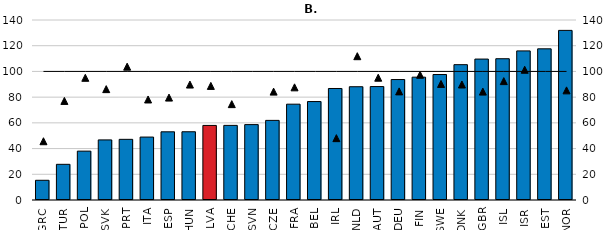
| Category | 1-9 persons employed |
|---|---|
| GRC | 15.326 |
| TUR | 27.756 |
| POL | 38.006 |
| SVK | 46.738 |
| PRT | 47.185 |
| ITA | 48.942 |
| ESP | 53.031 |
| HUN | 53.082 |
| LVA | 58.004 |
| CHE | 58.036 |
| SVN | 58.636 |
| CZE | 61.92 |
| FRA | 74.529 |
| BEL | 76.573 |
| IRL | 86.727 |
| NLD | 88.1 |
| AUT | 88.227 |
| DEU | 93.696 |
| FIN | 95.542 |
| SWE | 97.589 |
| DNK | 105.266 |
| GBR | 109.607 |
| ISL | 109.882 |
| ISR | 115.962 |
| EST | 117.587 |
| NOR | 131.921 |